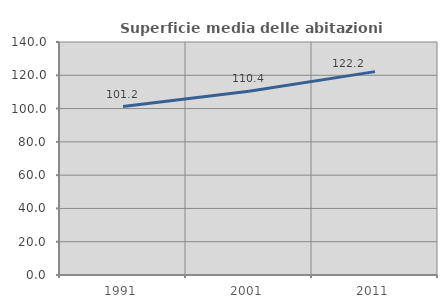
| Category | Superficie media delle abitazioni occupate |
|---|---|
| 1991.0 | 101.24 |
| 2001.0 | 110.437 |
| 2011.0 | 122.207 |